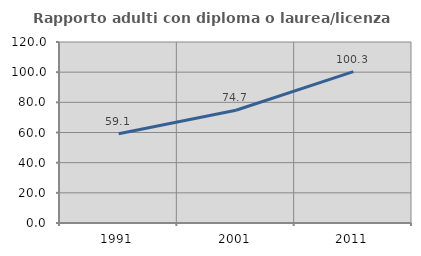
| Category | Rapporto adulti con diploma o laurea/licenza media  |
|---|---|
| 1991.0 | 59.113 |
| 2001.0 | 74.733 |
| 2011.0 | 100.344 |